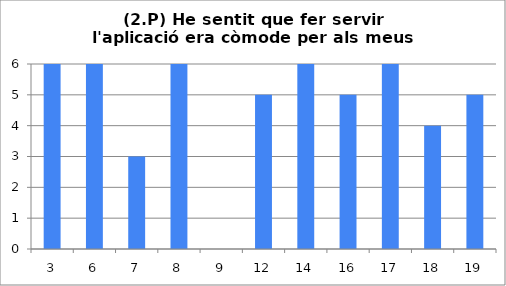
| Category | 2 |
|---|---|
| 3.0 | 6 |
| 6.0 | 6 |
| 7.0 | 3 |
| 8.0 | 6 |
| 9.0 | 0 |
| 12.0 | 5 |
| 14.0 | 6 |
| 16.0 | 5 |
| 17.0 | 6 |
| 18.0 | 4 |
| 19.0 | 5 |